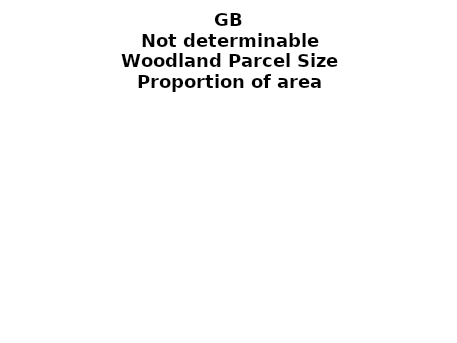
| Category | Not determinable |
|---|---|
| <5 ha | 0 |
| ≥5 and <10 ha | 0 |
| ≥10 and <15 ha | 0 |
| ≥15 and <20 ha | 0 |
| ≥20 and <25 ha | 0 |
| ≥25 and <30 ha | 0 |
| ≥30 and <35 ha | 0 |
| ≥35 and <40 ha | 0 |
| ≥40 and <45 ha | 0 |
| ≥45 and <50 ha | 0 |
| ≥50 and <60 ha | 0 |
| ≥60 and <70 ha | 0 |
| ≥70 and <80 ha | 0 |
| ≥80 and <90 ha | 0 |
| ≥90 and <100 ha | 0 |
| ≥100 and <150 ha | 0 |
| ≥150 and <200 ha | 0 |
| ≥200 ha | 0.005 |